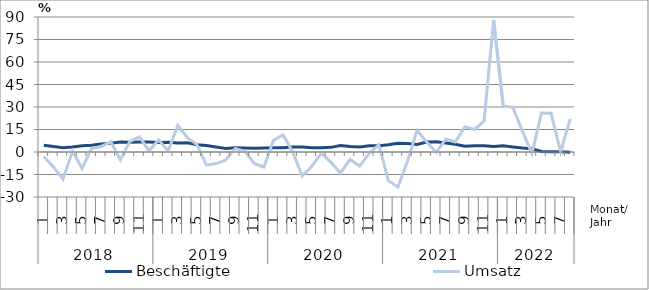
| Category | Beschäftigte | Umsatz |
|---|---|---|
| 0 | 4.5 | -3 |
| 1 | 3.6 | -9.8 |
| 2 | 2.9 | -18.1 |
| 3 | 3.4 | 0.5 |
| 4 | 4.2 | -11 |
| 5 | 4.5 | 2.5 |
| 6 | 5.3 | 3.7 |
| 7 | 5.8 | 6.8 |
| 8 | 6.6 | -5.2 |
| 9 | 6.5 | 7.1 |
| 10 | 6.6 | 10.1 |
| 11 | 6.6 | 0.8 |
| 12 | 6.4 | 8.2 |
| 13 | 6.5 | 0.6 |
| 14 | 6 | 17.8 |
| 15 | 6.1 | 9.6 |
| 16 | 4.9 | 4.9 |
| 17 | 4.3 | -8.8 |
| 18 | 3.3 | -7.7 |
| 19 | 2.4 | -5.4 |
| 20 | 2.8 | 2.4 |
| 21 | 2.7 | 0.5 |
| 22 | 2.5 | -7.6 |
| 23 | 2.7 | -10 |
| 24 | 2.9 | 7.8 |
| 25 | 2.9 | 11.5 |
| 26 | 3.4 | 0.1 |
| 27 | 3.4 | -16.1 |
| 28 | 2.9 | -9.5 |
| 29 | 2.9 | -0.8 |
| 30 | 3.1 | -6.9 |
| 31 | 4.3 | -14 |
| 32 | 3.6 | -4.9 |
| 33 | 3.4 | -9.4 |
| 34 | 4.1 | -0.9 |
| 35 | 4.1 | 4.9 |
| 36 | 4.8 | -19.1 |
| 37 | 5.8 | -23.3 |
| 38 | 5.6 | -6.1 |
| 39 | 5 | 14.4 |
| 40 | 6.6 | 6.6 |
| 41 | 6.9 | -0.3 |
| 42 | 6 | 8.7 |
| 43 | 5.2 | 6.7 |
| 44 | 3.8 | 16.9 |
| 45 | 4.2 | 15 |
| 46 | 4.2 | 20.6 |
| 47 | 3.7 | 88.1 |
| 48 | 4.1 | 30.7 |
| 49 | 3.4 | 29.8 |
| 50 | 2.6 | 14.1 |
| 51 | 2.1 | -1.1 |
| 52 | 0.3 | 26 |
| 53 | 0.2 | 25.8 |
| 54 | 0.1 | 0.2 |
| 55 | -0.1 | 22.1 |